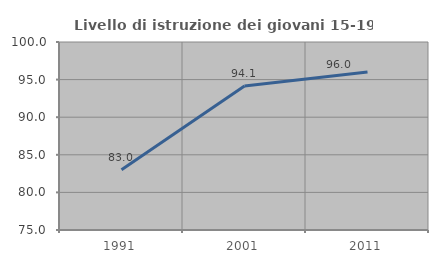
| Category | Livello di istruzione dei giovani 15-19 anni |
|---|---|
| 1991.0 | 83.002 |
| 2001.0 | 94.142 |
| 2011.0 | 96.021 |